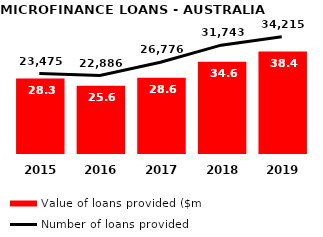
| Category | Value of loans provided ($m) |
|---|---|
| 2019.0 | 38.4 |
| 2018.0 | 34.63 |
| 2017.0 | 28.6 |
| 2016.0 | 25.6 |
| 2015.0 | 28.3 |